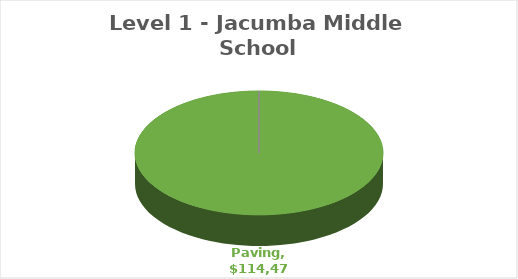
| Category | Series 0 |
|---|---|
| Electrical | 0 |
| Fencing | 0 |
| Finishes | 0 |
| HVAC | 0 |
| LowVoltage | 0 |
| Paving | 114476.75 |
| Plumbing | 0 |
| Roofing | 0 |
| Playground | 0 |